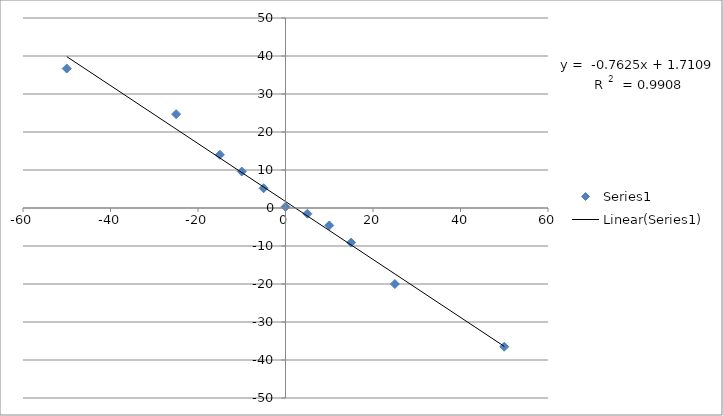
| Category | Series 0 |
|---|---|
| -50.0 | 36.7 |
| -25.0 | 24.7 |
| -15.0 | 14 |
| -10.0 | 9.6 |
| -5.0 | 5.2 |
| 0.0 | 0.32 |
| 5.0 | -1.5 |
| 10.0 | -4.6 |
| 15.0 | -9.1 |
| 25.0 | -20 |
| 50.0 | -36.5 |